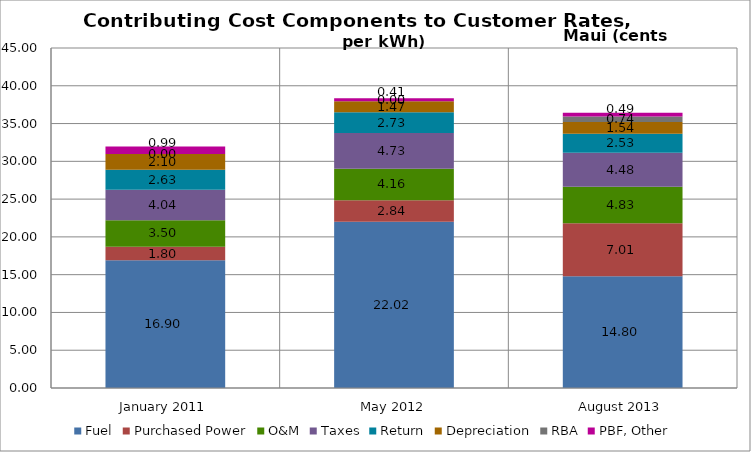
| Category | Fuel | Purchased Power | O&M | Taxes | Return | Depreciation | RBA | PBF, Other |
|---|---|---|---|---|---|---|---|---|
| January 2011 | 16.9 | 1.8 | 3.5 | 4.04 | 2.63 | 2.1 | 0 | 0.99 |
| May 2012 | 22.02 | 2.84 | 4.16 | 4.73 | 2.73 | 1.47 | 0 | 0.41 |
| August 2013 | 14.8 | 7.01 | 4.83 | 4.48 | 2.53 | 1.54 | 0.74 | 0.49 |